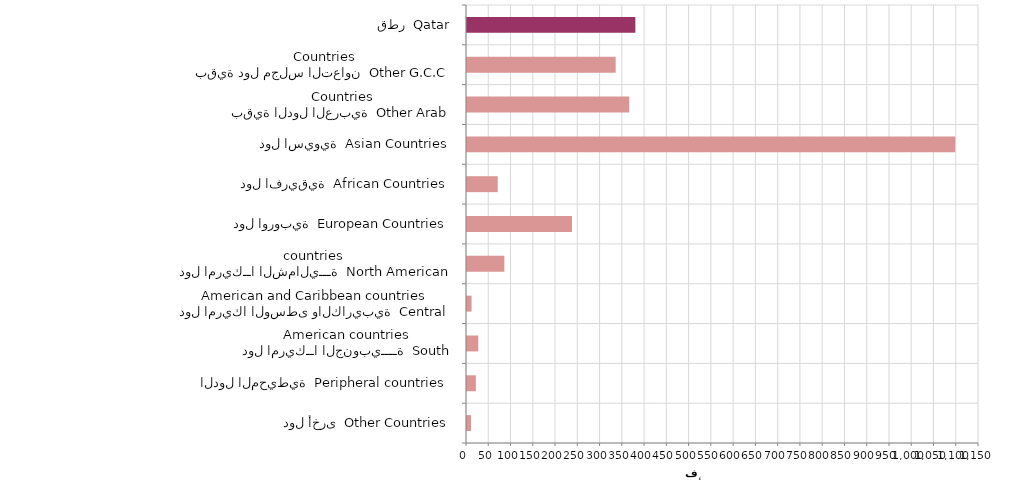
| Category | Series 0 |
|---|---|
| دول أخرى  Other Countries | 9186 |
| الدول المحيطية  Peripheral countries | 19974 |
| دول امريكــا الجنوبيــــة  South American countries | 25280 |
| دول امريكا الوسطى والكاريبية  Central American and Caribbean countries | 10249 |
| دول امريكــا الشماليـــة  North American countries  | 83910 |
| دول اوروبية  European Countries | 235760 |
| دول افريقية  African Countries | 68994 |
| دول اسيوية  Asian Countries | 1096582 |
| بقية الدول العربية  Other Arab Countries | 364438 |
| بقية دول مجلس التعاون  Other G.C.C Countries | 333953 |
| قطر  Qatar | 378179 |